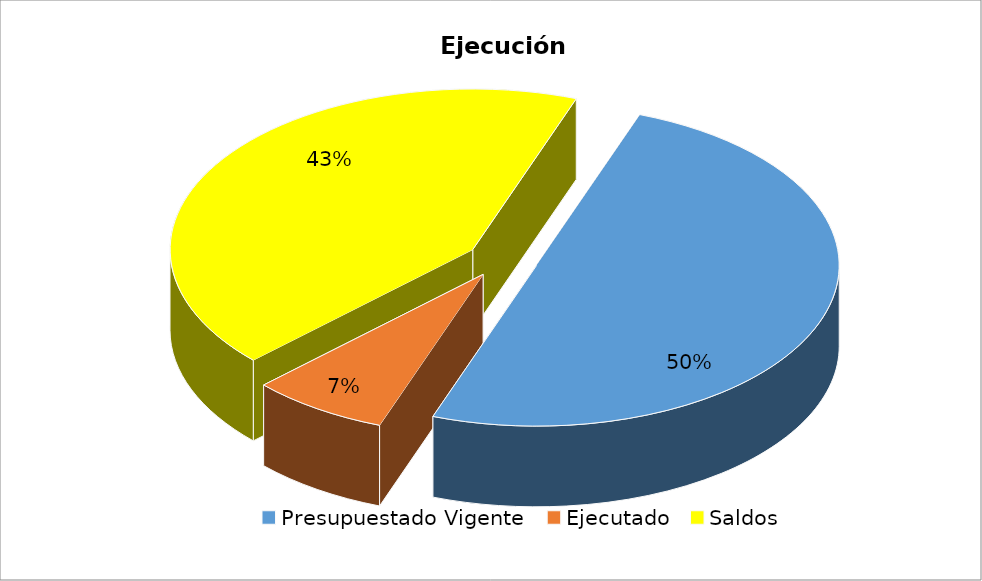
| Category | Series 0 |
|---|---|
| Presupuestado Vigente | 10358874843 |
| Ejecutado | 1522901596 |
| Saldos | 8835973247 |